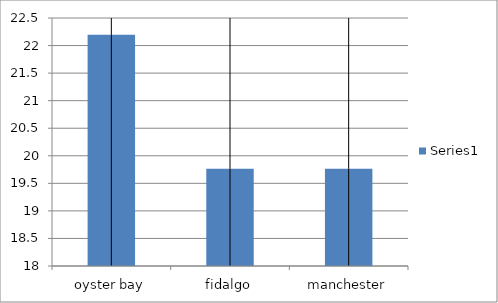
| Category | Series 0 |
|---|---|
| oyster bay | 22.194 |
| fidalgo | 19.765 |
| manchester | 19.764 |